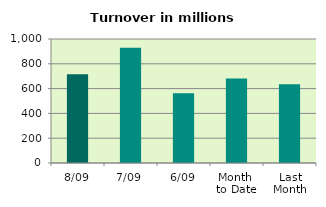
| Category | Series 0 |
|---|---|
| 8/09 | 716.515 |
| 7/09 | 928.579 |
| 6/09 | 561.697 |
| Month 
to Date | 680.635 |
| Last
Month | 635.477 |